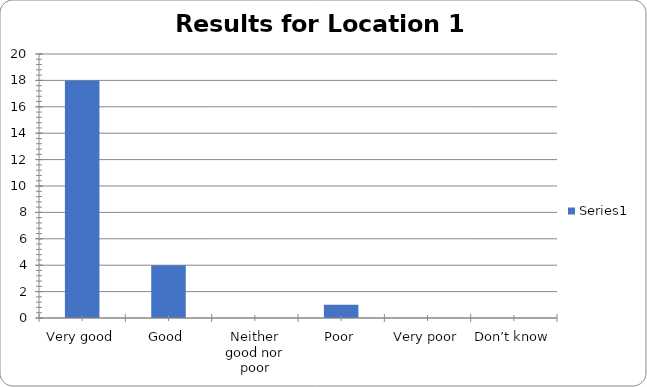
| Category | Series 0 |
|---|---|
| Very good | 18 |
| Good | 4 |
| Neither good nor poor | 0 |
| Poor | 1 |
| Very poor | 0 |
| Don’t know | 0 |